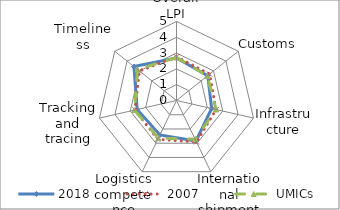
| Category | 2018 | 2007 | UMICs |
|---|---|---|---|
| Overall LPI | 2.693 | 2.768 | 2.721 |
| Customs | 2.529 | 2.682 | 2.493 |
| Infrastructure | 2.281 | 2.571 | 2.567 |
| International shipments | 2.844 | 2.913 | 2.718 |
| Logistics competence | 2.421 | 2.727 | 2.64 |
| Tracking and tracing | 2.555 | 2.7 | 2.727 |
| Timeliness | 3.446 | 3 | 3.159 |